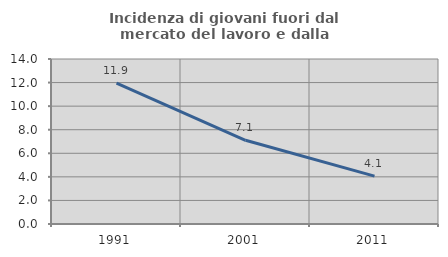
| Category | Incidenza di giovani fuori dal mercato del lavoro e dalla formazione  |
|---|---|
| 1991.0 | 11.947 |
| 2001.0 | 7.101 |
| 2011.0 | 4.065 |